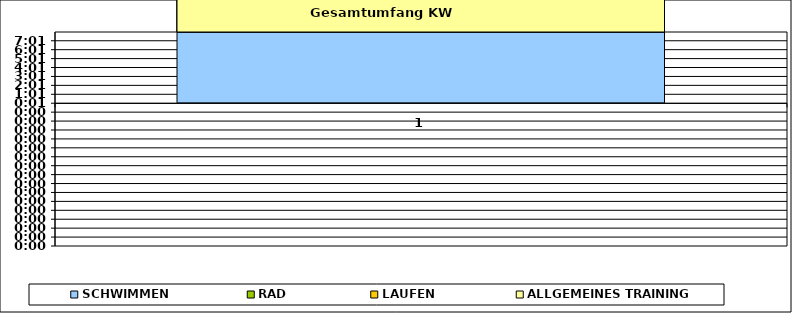
| Category | SCHWIMMEN | RAD | LAUFEN | ALLGEMEINES TRAINING |
|---|---|---|---|---|
| 0 | 1 | 1 | 1 | 1 |